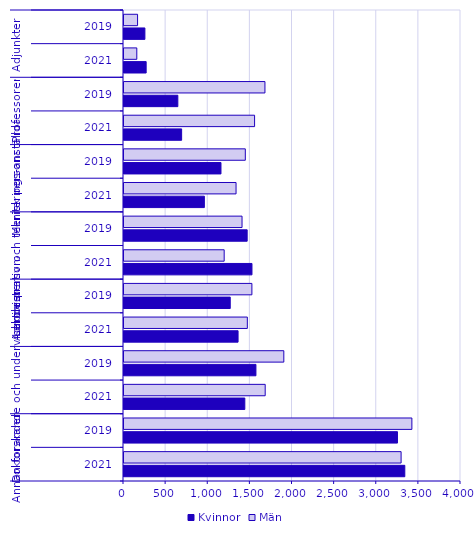
| Category | Kvinnor | Män |
|---|---|---|
| 0 | 3333 | 3289 |
| 1 | 3246 | 3417 |
| 2 | 1434 | 1676 |
| 3 | 1566 | 1897 |
| 4 | 1354 | 1464 |
| 5 | 1261 | 1518 |
| 6 | 1519 | 1189 |
| 7 | 1462 | 1401 |
| 8 | 954 | 1330 |
| 9 | 1151 | 1440 |
| 10 | 684 | 1550 |
| 11 | 639 | 1673 |
| 12 | 263 | 152 |
| 13 | 248 | 161 |